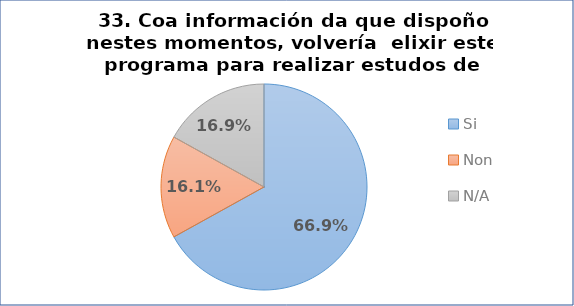
| Category | Pregunta 33. Coa información da que dispoño nestes momentos, volvería  elixir este programa para realizar estudos de doutoramento |
|---|---|
| Si | 0.669 |
| Non | 0.161 |
| N/A | 0.169 |